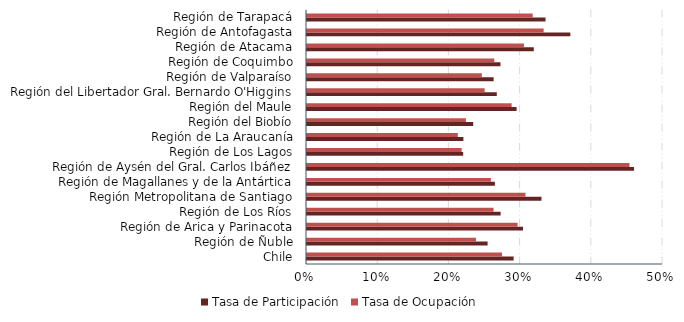
| Category | Tasa de Participación | Tasa de Ocupación |
|---|---|---|
| Chile | 0.29 | 0.274 |
| Región de Ñuble | 0.254 | 0.237 |
| Región de Arica y Parinacota | 0.303 | 0.296 |
| Región de Los Ríos | 0.272 | 0.262 |
| Región Metropolitana de Santiago | 0.329 | 0.307 |
| Región de Magallanes y de la Antártica | 0.264 | 0.258 |
| Región de Aysén del Gral. Carlos Ibáñez | 0.459 | 0.453 |
| Región de Los Lagos | 0.219 | 0.217 |
| Región de La Araucanía | 0.22 | 0.212 |
| Región del Biobío | 0.233 | 0.223 |
| Región del Maule | 0.294 | 0.287 |
| Región del Libertador Gral. Bernardo O'Higgins | 0.267 | 0.249 |
| Región de Valparaíso | 0.262 | 0.246 |
| Región de Coquimbo | 0.272 | 0.263 |
| Región de Atacama | 0.319 | 0.305 |
| Región de Antofagasta | 0.37 | 0.332 |
| Región de Tarapacá | 0.335 | 0.317 |